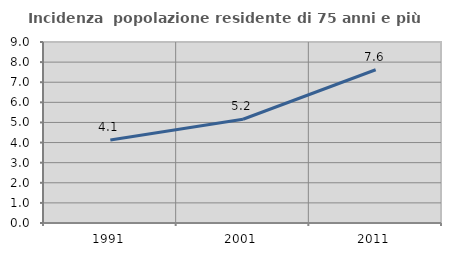
| Category | Incidenza  popolazione residente di 75 anni e più |
|---|---|
| 1991.0 | 4.127 |
| 2001.0 | 5.16 |
| 2011.0 | 7.62 |